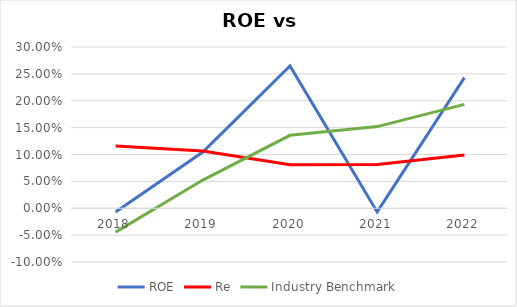
| Category | ROE | Re | Industry Benchmark |
|---|---|---|---|
| 2018.0 | -0.007 | 0.116 | -0.044 |
| 2019.0 | 0.105 | 0.107 | 0.052 |
| 2020.0 | 0.265 | 0.081 | 0.136 |
| 2021.0 | -0.007 | 0.081 | 0.152 |
| 2022.0 | 0.243 | 0.099 | 0.193 |